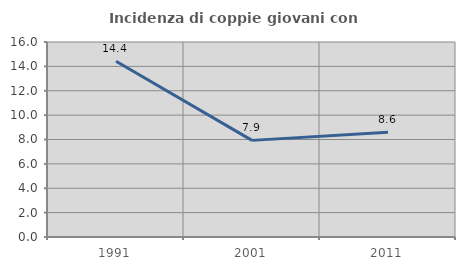
| Category | Incidenza di coppie giovani con figli |
|---|---|
| 1991.0 | 14.419 |
| 2001.0 | 7.928 |
| 2011.0 | 8.596 |